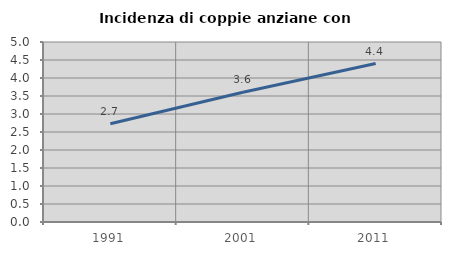
| Category | Incidenza di coppie anziane con figli |
|---|---|
| 1991.0 | 2.731 |
| 2001.0 | 3.602 |
| 2011.0 | 4.4 |